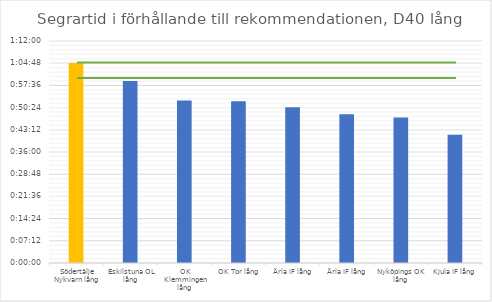
| Category | D40 tid |
|---|---|
| Södertälje Nykvarn lång | 0.045 |
| Eskilstuna OL lång | 0.041 |
| OK Klemmingen lång | 0.037 |
| OK Tor lång | 0.036 |
| Ärla IF lång | 0.035 |
| Ärla IF lång | 0.034 |
| Nyköpings OK lång | 0.033 |
| Kjula IF lång | 0.029 |